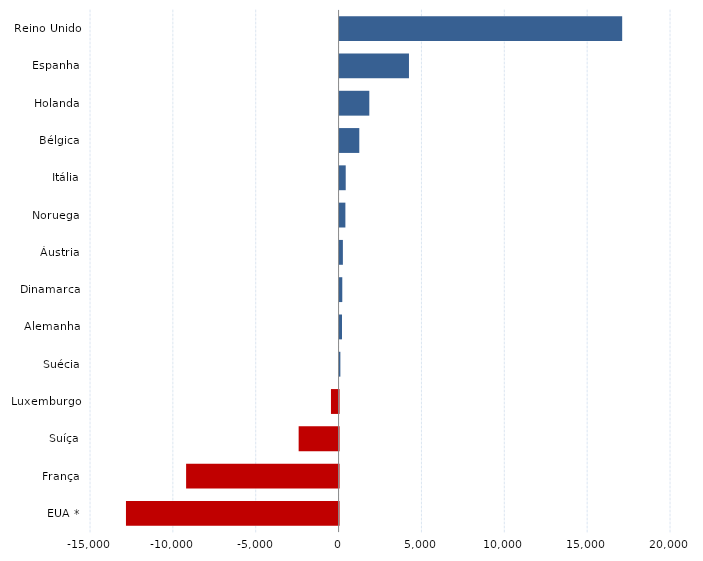
| Category | Series 0 |
|---|---|
| EUA * | -12830 |
| França | -9200 |
| Suíça | -2409 |
| Luxemburgo | -459 |
| Suécia | 48 |
| Alemanha | 145 |
| Dinamarca | 164 |
| Áustria | 200 |
| Noruega | 351 |
| Itália | 371 |
| Bélgica | 1190 |
| Holanda | 1795 |
| Espanha | 4188 |
| Reino Unido | 17054 |